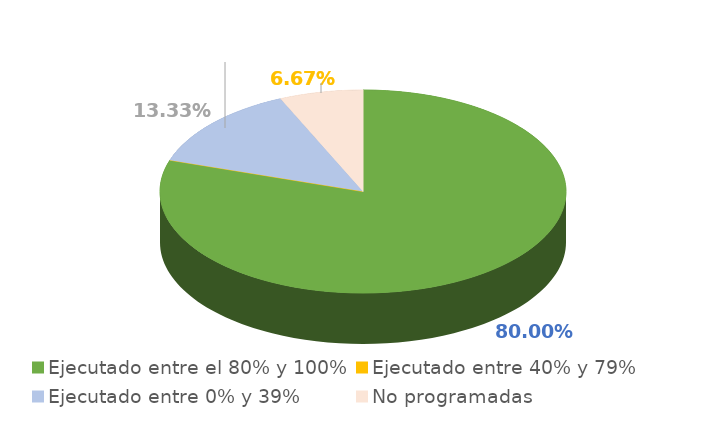
| Category | Series 0 |
|---|---|
| Ejecutado entre el 80% y 100% | 0.8 |
| Ejecutado entre 40% y 79% | 0 |
| Ejecutado entre 0% y 39% | 0.133 |
| No programadas | 0.067 |